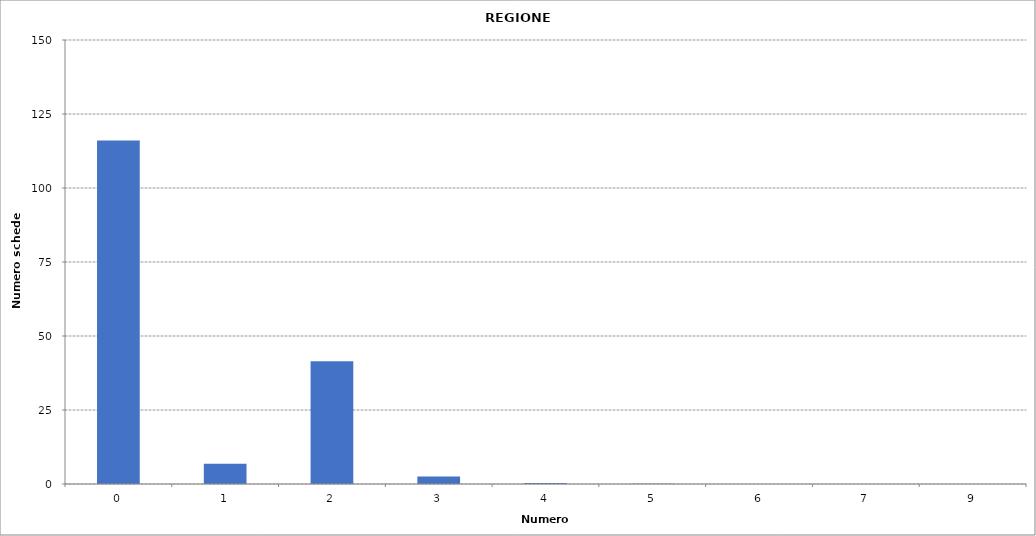
| Category | Series 0 |
|---|---|
| 0.0 | 116017 |
| 1.0 | 6832 |
| 2.0 | 41487 |
| 3.0 | 2576 |
| 4.0 | 367 |
| 5.0 | 80 |
| 6.0 | 22 |
| 7.0 | 1 |
| 9.0 | 1 |